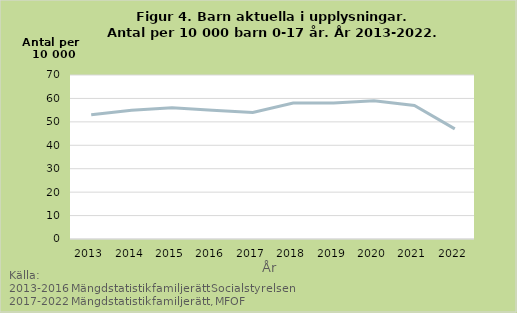
| Category | Upplysningar |
|---|---|
| 2013.0 | 53 |
| 2014.0 | 55 |
| 2015.0 | 56 |
| 2016.0 | 55 |
| 2017.0 | 54 |
| 2018.0 | 58 |
| 2019.0 | 58 |
| 2020.0 | 59 |
| 2021.0 | 57 |
| 2022.0 | 47 |